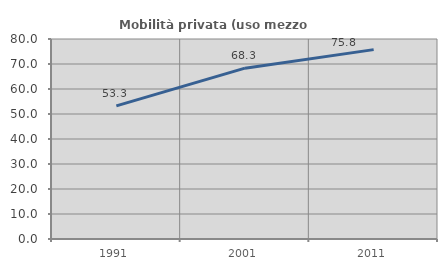
| Category | Mobilità privata (uso mezzo privato) |
|---|---|
| 1991.0 | 53.268 |
| 2001.0 | 68.335 |
| 2011.0 | 75.753 |